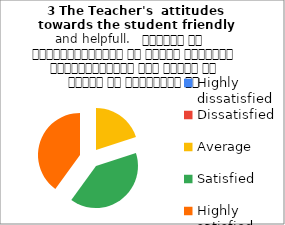
| Category | 3 The Teacher's  attitudes towards the student friendly and helpfull.   शिक्षक का विद्यार्थियों के प्रति व्यवहार मित्रतापूर्ण एवम सहयोग के भावना से परिपूर्ण था |
|---|---|
| Highly dissatisfied | 0 |
| Dissatisfied | 0 |
| Average | 1 |
| Satisfied | 2 |
| Highly satisfied | 2 |